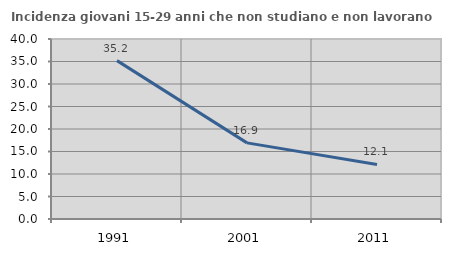
| Category | Incidenza giovani 15-29 anni che non studiano e non lavorano  |
|---|---|
| 1991.0 | 35.196 |
| 2001.0 | 16.919 |
| 2011.0 | 12.121 |